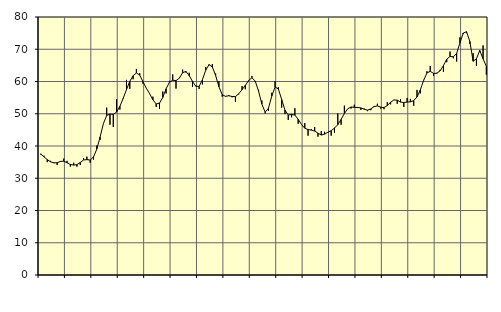
| Category | Piggar | Series 1 |
|---|---|---|
| nan | 37.4 | 37.57 |
| 87.0 | 37 | 36.64 |
| 87.0 | 35 | 35.78 |
| 87.0 | 35.4 | 35.1 |
| nan | 34.9 | 34.76 |
| 88.0 | 34.1 | 34.82 |
| 88.0 | 35.1 | 35.21 |
| 88.0 | 36.1 | 35.29 |
| nan | 35.4 | 34.79 |
| 89.0 | 33.6 | 34.28 |
| 89.0 | 34.8 | 34.08 |
| 89.0 | 33.6 | 34.22 |
| nan | 34.1 | 34.89 |
| 90.0 | 36.2 | 35.66 |
| 90.0 | 36.7 | 35.78 |
| 90.0 | 34.8 | 35.65 |
| nan | 35.8 | 36.59 |
| 91.0 | 40.1 | 39 |
| 91.0 | 41.9 | 42.74 |
| 91.0 | 46.9 | 46.92 |
| nan | 51.9 | 49.46 |
| 92.0 | 46.6 | 49.9 |
| 92.0 | 45.9 | 49.81 |
| 92.0 | 54.5 | 50.51 |
| nan | 51.3 | 52.31 |
| 93.0 | 54.6 | 54.77 |
| 93.0 | 60.5 | 57.49 |
| 93.0 | 57.7 | 60.07 |
| nan | 60.7 | 61.78 |
| 94.0 | 63.9 | 62.64 |
| 94.0 | 62.6 | 62.01 |
| 94.0 | 59.3 | 59.92 |
| nan | 57.9 | 57.93 |
| 95.0 | 56.1 | 56.25 |
| 95.0 | 55.3 | 54.33 |
| 95.0 | 52.1 | 53.03 |
| nan | 51.5 | 53.29 |
| 96.0 | 56.9 | 55.06 |
| 96.0 | 56.3 | 57.74 |
| 96.0 | 60.2 | 59.78 |
| nan | 62.2 | 60.39 |
| 97.0 | 57.8 | 60.28 |
| 97.0 | 61.1 | 61.04 |
| 97.0 | 63.7 | 62.73 |
| nan | 62.8 | 63.13 |
| 98.0 | 62.7 | 61.82 |
| 98.0 | 58.3 | 60.02 |
| 98.0 | 58.7 | 58.52 |
| nan | 57.7 | 58.47 |
| 99.0 | 59.1 | 60.55 |
| 99.0 | 64.5 | 63.51 |
| 99.0 | 65.4 | 65.21 |
| nan | 65.4 | 64.54 |
| 0.0 | 62.5 | 61.85 |
| 0.0 | 60.1 | 58.37 |
| 0.0 | 55.3 | 55.91 |
| nan | 55.5 | 55.4 |
| 1.0 | 55.8 | 55.59 |
| 1.0 | 55.1 | 55.34 |
| 1.0 | 53.7 | 55.32 |
| nan | 56 | 56.2 |
| 2.0 | 58.6 | 57.46 |
| 2.0 | 57.6 | 58.81 |
| 2.0 | 60.1 | 60.3 |
| nan | 61.7 | 61.16 |
| 3.0 | 59.9 | 60.12 |
| 3.0 | 57.4 | 57.01 |
| 3.0 | 54.1 | 53 |
| nan | 50.1 | 50.51 |
| 4.0 | 50.9 | 51.68 |
| 4.0 | 56.5 | 55.46 |
| 4.0 | 60.1 | 58.3 |
| nan | 58.2 | 57.7 |
| 5.0 | 51.9 | 54.43 |
| 5.0 | 49.9 | 51.14 |
| 5.0 | 48.1 | 49.6 |
| nan | 48.9 | 49.76 |
| 6.0 | 51.7 | 49.6 |
| 6.0 | 46.9 | 48.29 |
| 6.0 | 46.7 | 46.68 |
| nan | 47.1 | 45.51 |
| 7.0 | 43.2 | 45.1 |
| 7.0 | 45.2 | 44.94 |
| 7.0 | 45.9 | 44.62 |
| nan | 42.9 | 43.98 |
| 8.0 | 44.6 | 43.4 |
| 8.0 | 44.4 | 43.68 |
| 8.0 | 44.2 | 44.25 |
| nan | 43.2 | 44.75 |
| 9.0 | 44.1 | 45.55 |
| 9.0 | 50.1 | 46.6 |
| 9.0 | 46.6 | 48.24 |
| nan | 52.5 | 50.07 |
| 10.0 | 51.5 | 51.51 |
| 10.0 | 51.6 | 52.1 |
| 10.0 | 52.8 | 51.97 |
| nan | 52.1 | 51.96 |
| 11.0 | 51.2 | 51.82 |
| 11.0 | 51.6 | 51.4 |
| 11.0 | 50.8 | 51.11 |
| nan | 51.1 | 51.49 |
| 12.0 | 52.4 | 52.24 |
| 12.0 | 53.1 | 52.42 |
| 12.0 | 51.6 | 52.05 |
| nan | 51.4 | 51.91 |
| 13.0 | 53.6 | 52.55 |
| 13.0 | 52.9 | 53.56 |
| 13.0 | 54.3 | 54.28 |
| nan | 53.1 | 54.22 |
| 14.0 | 54.5 | 53.62 |
| 14.0 | 52.1 | 53.48 |
| 14.0 | 54.9 | 53.62 |
| nan | 54.6 | 53.7 |
| 15.0 | 52.5 | 54.07 |
| 15.0 | 57.4 | 55.19 |
| 15.0 | 56.3 | 57.39 |
| nan | 60.5 | 60.34 |
| 16.0 | 63.2 | 62.64 |
| 16.0 | 64.8 | 63.16 |
| 16.0 | 61.7 | 62.52 |
| nan | 62.7 | 62.54 |
| 17.0 | 63.6 | 63.32 |
| 17.0 | 63 | 64.91 |
| 17.0 | 66 | 66.9 |
| nan | 69.3 | 67.77 |
| 18.0 | 67.2 | 67.66 |
| 18.0 | 66.2 | 68.69 |
| 18.0 | 73.7 | 71.97 |
| nan | 74.7 | 75.03 |
| 19.0 | 75 | 75.44 |
| 19.0 | 71.7 | 72.44 |
| 19.0 | 68.8 | 66.28 |
| nan | 64.8 | 67.05 |
| 20.0 | 69.1 | 69.62 |
| 20.0 | 71.2 | 67.05 |
| 20.0 | 62.1 | 64.68 |